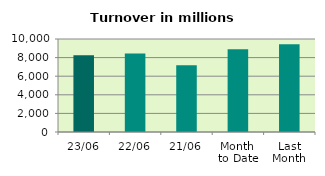
| Category | Series 0 |
|---|---|
| 23/06 | 8246.135 |
| 22/06 | 8448.229 |
| 21/06 | 7170.979 |
| Month 
to Date | 8906.622 |
| Last
Month | 9444.716 |